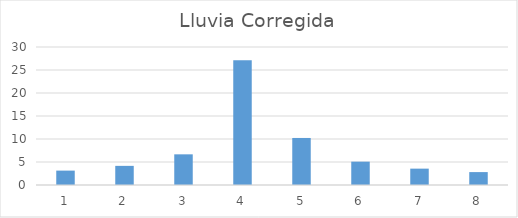
| Category | Lluvia Corregida |
|---|---|
| 0 | 3.128 |
| 1 | 4.159 |
| 2 | 6.667 |
| 3 | 27.145 |
| 4 | 10.226 |
| 5 | 5.075 |
| 6 | 3.557 |
| 7 | 2.806 |